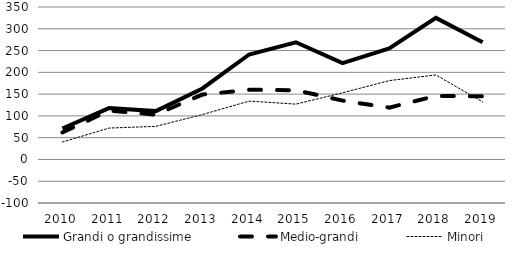
| Category | Grandi o grandissime | Medio-grandi | Minori |
|---|---|---|---|
| 2010.0 | 71 | 62 | 40 |
| 2011.0 | 118 | 112 | 72 |
| 2012.0 | 111 | 103 | 76 |
| 2013.0 | 163 | 149 | 103 |
| 2014.0 | 241 | 160 | 134 |
| 2015.0 | 269 | 159 | 127 |
| 2016.0 | 221 | 135 | 153 |
| 2017.0 | 255 | 119 | 181 |
| 2018.0 | 325 | 146 | 194 |
| 2019.0 | 269 | 145 | 132 |